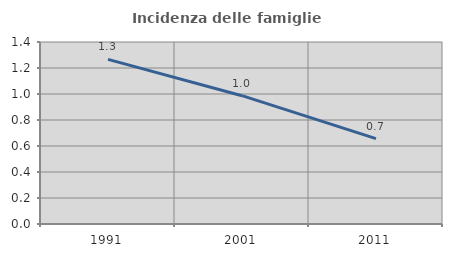
| Category | Incidenza delle famiglie numerose |
|---|---|
| 1991.0 | 1.266 |
| 2001.0 | 0.987 |
| 2011.0 | 0.656 |